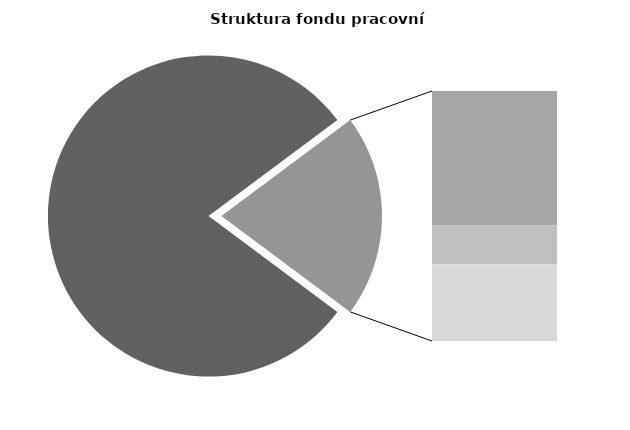
| Category | Series 0 |
|---|---|
| Průměrná měsíční odpracovaná doba bez přesčasu | 137.231 |
| Dovolená | 18.853 |
| Nemoc | 5.491 |
| Jiné | 10.767 |